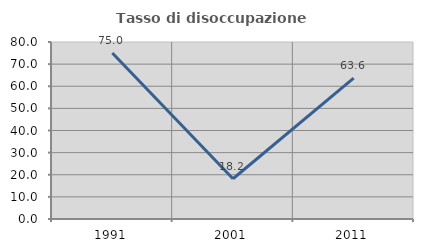
| Category | Tasso di disoccupazione giovanile  |
|---|---|
| 1991.0 | 75 |
| 2001.0 | 18.182 |
| 2011.0 | 63.636 |